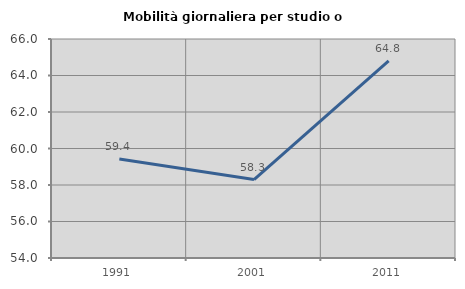
| Category | Mobilità giornaliera per studio o lavoro |
|---|---|
| 1991.0 | 59.429 |
| 2001.0 | 58.297 |
| 2011.0 | 64.8 |